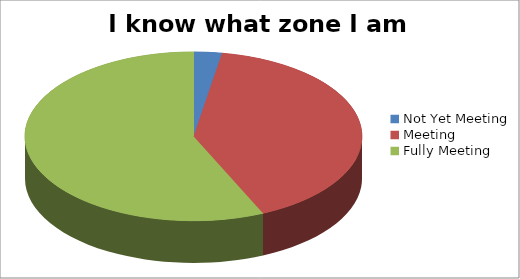
| Category | I know what zone I am in |
|---|---|
| Not Yet Meeting | 1 |
| Meeting | 15 |
| Fully Meeting | 21 |